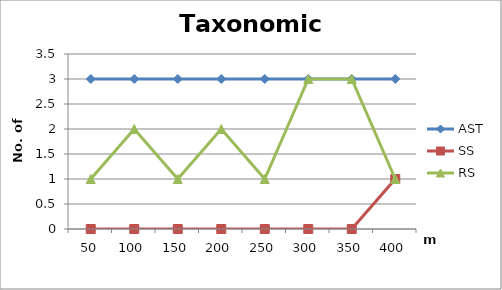
| Category | AST | SS | RS |
|---|---|---|---|
| 50.0 | 3 | 0 | 1 |
| 100.0 | 3 | 0 | 2 |
| 150.0 | 3 | 0 | 1 |
| 200.0 | 3 | 0 | 2 |
| 250.0 | 3 | 0 | 1 |
| 300.0 | 3 | 0 | 3 |
| 350.0 | 3 | 0 | 3 |
| 400.0 | 3 | 1 | 1 |